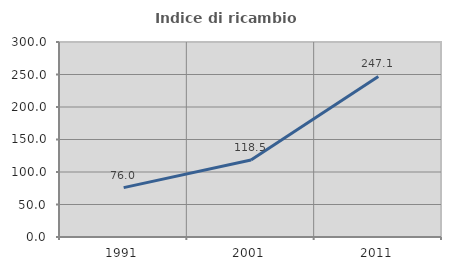
| Category | Indice di ricambio occupazionale  |
|---|---|
| 1991.0 | 75.969 |
| 2001.0 | 118.45 |
| 2011.0 | 247.059 |